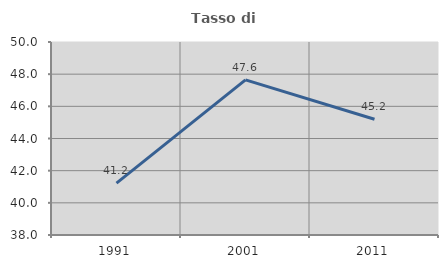
| Category | Tasso di occupazione   |
|---|---|
| 1991.0 | 41.223 |
| 2001.0 | 47.644 |
| 2011.0 | 45.198 |